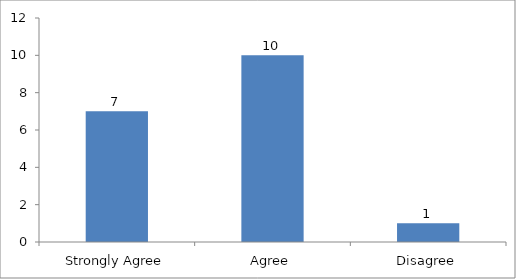
| Category | Do you think that the social entrepreneurship program of PVTC was able to promote entrepreneurial mind-set among youth? |
|---|---|
| Strongly Agree | 7 |
| Agree | 10 |
| Disagree | 1 |